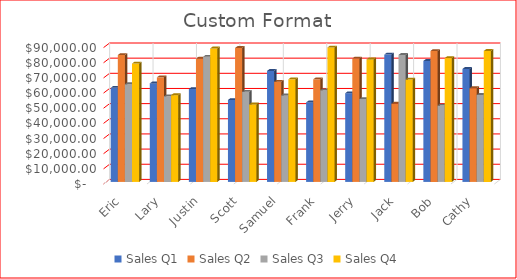
| Category | Sales |
|---|---|
| Eric | 78098 |
| Lary | 57226 |
| Justin | 88081 |
| Scott | 51151 |
| Samuel | 67691 |
| Frank | 88682 |
| Jerry | 80833 |
| Jack | 67518 |
| Bob | 81682 |
| Cathy | 86411 |